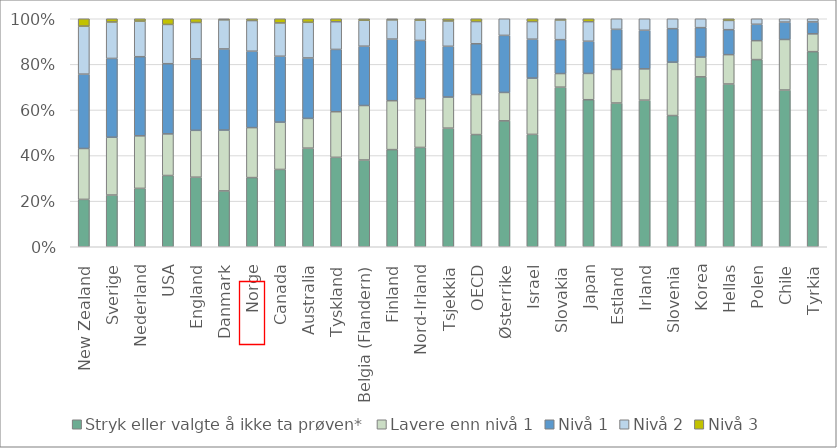
| Category | Stryk eller valgte å ikke ta prøven* | Lavere enn nivå 1 | Nivå 1 | Nivå 2 | Nivå 3 |
|---|---|---|---|---|---|
| New Zealand | 20.777 | 22.327 | 32.608 | 21.055 | 3.233 |
| Sverige | 22.683 | 25.356 | 34.56 | 15.985 | 1.416 |
| Nederland | 25.61 | 23.036 | 34.71 | 15.61 | 1.034 |
| USA | 31.244 | 18.261 | 30.78 | 17.214 | 2.501 |
| England | 30.509 | 20.546 | 31.339 | 15.964 | 1.642 |
| Danmark | 24.501 | 26.674 | 35.583 | 12.772 | 0.469 |
| Norge | 30.337 | 21.914 | 33.52 | 13.434 | 0.795 |
| Canada | 33.907 | 20.748 | 28.903 | 14.606 | 1.836 |
| Australia | 43.246 | 13.049 | 26.514 | 15.638 | 1.553 |
| Tyskland | 39.22 | 20.007 | 27.327 | 12.135 | 1.311 |
| Belgia (Flandern) | 38.044 | 23.901 | 26.017 | 11.386 | 0.652 |
| Finland | 42.599 | 21.46 | 27.023 | 8.434 | 0.483 |
| Nord-Irland | 43.553 | 21.412 | 25.526 | 8.906 | 0.604 |
| Tsjekkia | 52.017 | 13.639 | 22.259 | 11.125 | 0.96 |
| OECD | 49.356 | 17.631 | 22.334 | 9.759 | 1.237 |
| Østerrike | 55.095 | 12.42 | 24.971 | 7.279 | 0 |
| Israel | 49.287 | 24.673 | 17.072 | 7.733 | 1.235 |
| Slovakia | 69.996 | 5.966 | 14.872 | 8.646 | 0.52 |
| Japan | 64.494 | 11.523 | 14.127 | 8.57 | 1.286 |
| Estland | 62.93 | 14.706 | 17.555 | 4.642 | 0 |
| Irland | 64.151 | 13.685 | 16.895 | 5.037 | 0 |
| Slovenia | 57.425 | 23.362 | 14.674 | 4.336 | 0 |
| Korea | 74.381 | 8.661 | 12.879 | 3.896 | 0 |
| Hellas | 71.381 | 12.882 | 10.946 | 4.063 | 0.727 |
| Polen | 81.986 | 8.286 | 7.185 | 2.416 | 0 |
| Chile | 68.693 | 22.155 | 7.623 | 1.465 | 0 |
| Tyrkia | 85.184 | 7.77 | 5.209 | 1.387 | 0 |